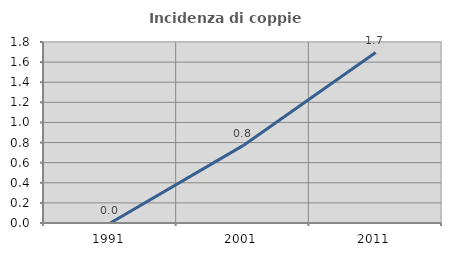
| Category | Incidenza di coppie miste |
|---|---|
| 1991.0 | 0 |
| 2001.0 | 0.769 |
| 2011.0 | 1.695 |